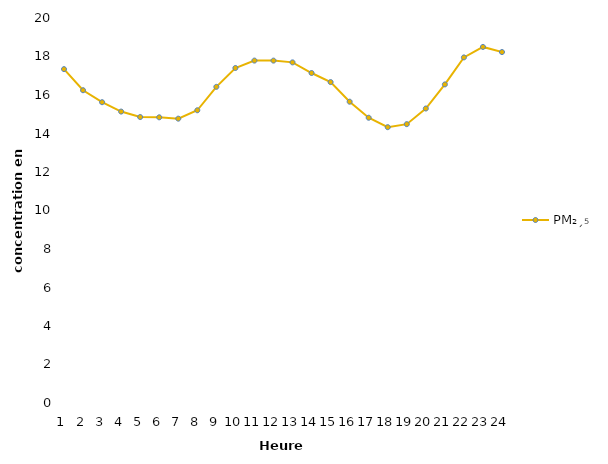
| Category | PM₂ˏ₅ |
|---|---|
| 0 | 17.344 |
| 1 | 16.248 |
| 2 | 15.626 |
| 3 | 15.139 |
| 4 | 14.855 |
| 5 | 14.841 |
| 6 | 14.771 |
| 7 | 15.207 |
| 8 | 16.424 |
| 9 | 17.403 |
| 10 | 17.787 |
| 11 | 17.786 |
| 12 | 17.695 |
| 13 | 17.143 |
| 14 | 16.671 |
| 15 | 15.652 |
| 16 | 14.819 |
| 17 | 14.328 |
| 18 | 14.486 |
| 19 | 15.299 |
| 20 | 16.551 |
| 21 | 17.953 |
| 22 | 18.497 |
| 23 | 18.231 |